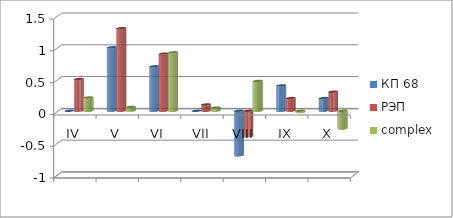
| Category | КП 68 | РЭП  | complex |
|---|---|---|---|
| IV | 0 | 0.5 | 0.21 |
| V | 1 | 1.3 | 0.06 |
| VI | 0.7 | 0.9 | 0.92 |
| VII | 0 | 0.1 | 0.05 |
| VIII | -0.7 | -0.4 | 0.47 |
| IX | 0.4 | 0.2 | -0.02 |
| X | 0.2 | 0.3 | -0.28 |